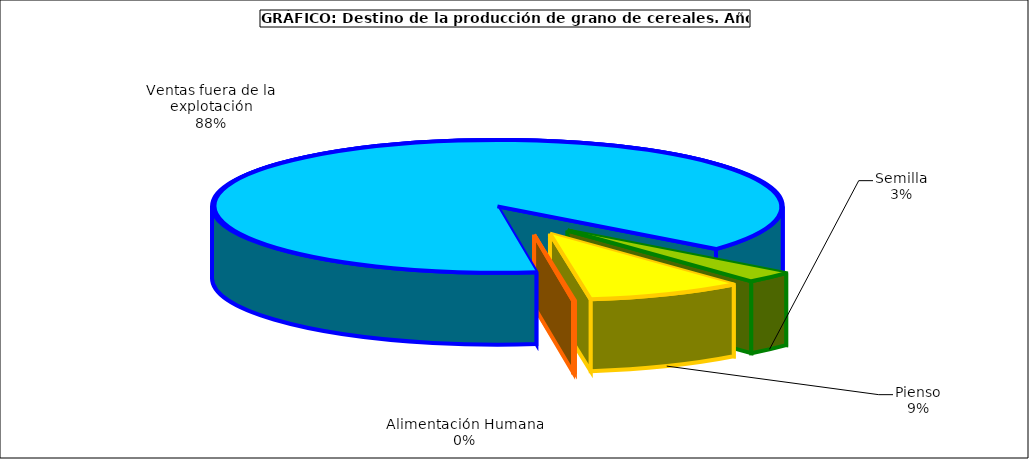
| Category | Series 0 |
|---|---|
| 0 | 674855 |
| 1 | 2167614 |
| 2 | 24971 |
| 3 | 21623415 |